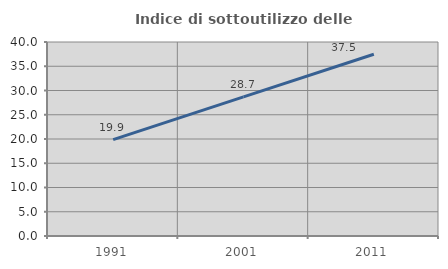
| Category | Indice di sottoutilizzo delle abitazioni  |
|---|---|
| 1991.0 | 19.864 |
| 2001.0 | 28.671 |
| 2011.0 | 37.474 |